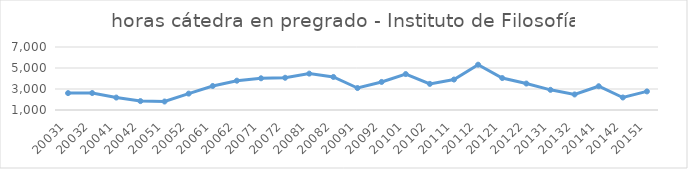
| Category | Total horas |
|---|---|
| 20031 | 2608 |
| 20032 | 2616 |
| 20041 | 2184 |
| 20042 | 1848 |
| 20051 | 1808 |
| 20052 | 2560 |
| 20061 | 3288 |
| 20062 | 3792 |
| 20071 | 4020 |
| 20072 | 4070 |
| 20081 | 4464 |
| 20082 | 4146 |
| 20091 | 3092 |
| 20092 | 3672 |
| 20101 | 4422 |
| 20102 | 3488 |
| 20111 | 3900 |
| 20112 | 5315 |
| 20121 | 4042 |
| 20122 | 3519 |
| 20131 | 2920 |
| 20132 | 2480 |
| 20141 | 3264 |
| 20142 | 2191 |
| 20151 | 2770 |